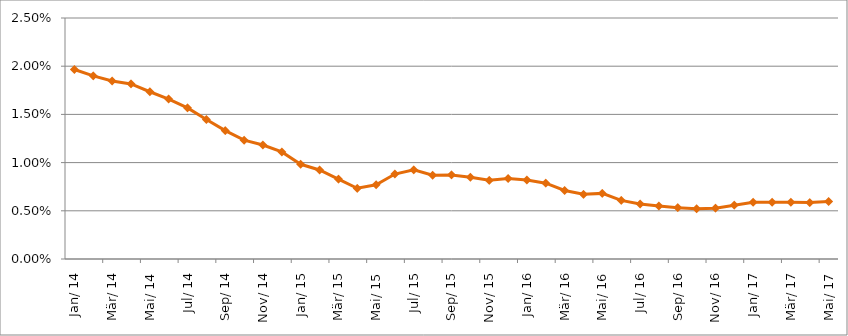
| Category | Durchschnittszins |
|---|---|
| 2014-01-01 | 0.02 |
| 2014-02-01 | 0.019 |
| 2014-03-01 | 0.018 |
| 2014-04-01 | 0.018 |
| 2014-05-01 | 0.017 |
| 2014-06-01 | 0.017 |
| 2014-07-01 | 0.016 |
| 2014-08-01 | 0.014 |
| 2014-09-01 | 0.013 |
| 2014-10-01 | 0.012 |
| 2014-11-01 | 0.012 |
| 2014-12-01 | 0.011 |
| 2015-01-01 | 0.01 |
| 2015-02-01 | 0.009 |
| 2015-03-01 | 0.008 |
| 2015-04-01 | 0.007 |
| 2015-05-01 | 0.008 |
| 2015-06-01 | 0.009 |
| 2015-07-01 | 0.009 |
| 2015-08-01 | 0.009 |
| 2015-09-01 | 0.009 |
| 2015-10-01 | 0.008 |
| 2015-11-01 | 0.008 |
| 2015-12-01 | 0.008 |
| 2016-01-01 | 0.008 |
| 2016-02-01 | 0.008 |
| 2016-03-01 | 0.007 |
| 2016-04-01 | 0.007 |
| 2016-05-01 | 0.007 |
| 2016-06-01 | 0.006 |
| 2016-07-01 | 0.006 |
| 2016-08-01 | 0.005 |
| 2016-09-01 | 0.005 |
| 2016-10-01 | 0.005 |
| 2016-11-01 | 0.005 |
| 2016-12-01 | 0.006 |
| 2017-01-01 | 0.006 |
| 2017-02-01 | 0.006 |
| 2017-03-01 | 0.006 |
| 2017-04-01 | 0.006 |
| 2017-05-01 | 0.006 |